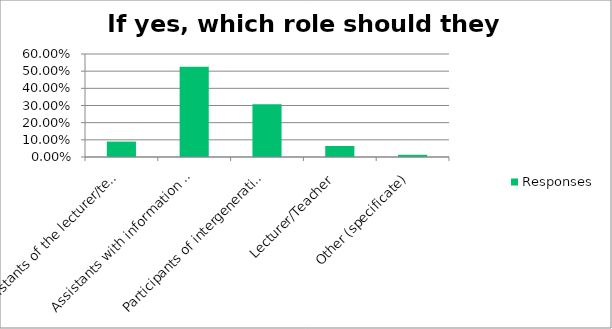
| Category | Responses |
|---|---|
| Assistants of the lecturer/teacher | 0.09 |
| Assistants with information technologies | 0.526 |
| Participants of intergeneration dialogue | 0.308 |
| Lecturer/Teacher | 0.064 |
| Other (specificate) | 0.013 |